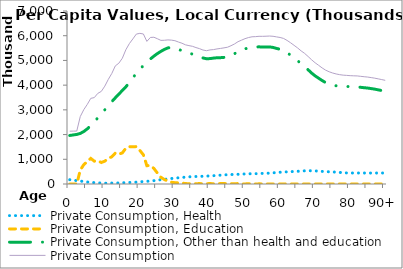
| Category | Private Consumption, Health | Private Consumption, Education | Private Consumption, Other than health and education | Private Consumption |
|---|---|---|---|---|
| 0 | 173853.621 | 0 | 1963426.39 | 2137280.01 |
|  | 155418.292 | 0 | 1984840.847 | 2140259.139 |
| 2 | 136982.963 | 0 | 2005407.284 | 2142390.247 |
| 3 | 118547.634 | 563864.51 | 2046643.158 | 2729055.303 |
| 4 | 100112.306 | 783621.737 | 2123383.9 | 3007117.942 |
| 5 | 81676.977 | 906953.405 | 2231471.992 | 3220102.374 |
| 6 | 65371.596 | 1036358.571 | 2364540.45 | 3466270.617 |
| 7 | 55404.873 | 923372.357 | 2516815.128 | 3495592.358 |
| 8 | 46769.484 | 944300.276 | 2675364.176 | 3666433.936 |
| 9 | 38355.059 | 869132.09 | 2839354.817 | 3746841.967 |
| 10 | 32100.795 | 925137.553 | 3002329.648 | 3959567.996 |
| 11 | 35147.378 | 1032438.103 | 3166960.657 | 4234546.138 |
| 12 | 37908.249 | 1103334.687 | 3332420.873 | 4473663.808 |
| 13 | 40200.229 | 1252647.324 | 3487364.802 | 4780212.354 |
| 14 | 43039.774 | 1206091.938 | 3638530.026 | 4887661.739 |
| 15 | 49285.257 | 1257732.99 | 3782323.214 | 5089341.462 |
| 16 | 55375.808 | 1445821.403 | 3930143.355 | 5431340.566 |
| 17 | 61417.954 | 1509816.078 | 4108632.358 | 5679866.39 |
| 18 | 68628.542 | 1504838.275 | 4296283.09 | 5869749.907 |
| 19 | 76582.108 | 1513842.453 | 4476067.196 | 6066491.756 |
| 20 | 88860.388 | 1359057.82 | 4647778.962 | 6095697.17 |
| 21 | 98957.613 | 1182570.649 | 4788504.256 | 6070032.518 |
| 22 | 109801.226 | 740996.506 | 4919613.663 | 5770411.396 |
| 23 | 121464.109 | 750422.563 | 5057446.402 | 5929333.074 |
| 24 | 135444.22 | 629214.865 | 5173731.841 | 5938390.926 |
| 25 | 156962.234 | 443621.995 | 5277370.327 | 5877954.556 |
| 26 | 172335.759 | 272082.706 | 5366790.945 | 5811209.41 |
| 27 | 188542.414 | 180641.899 | 5446422.106 | 5815606.42 |
| 28 | 205697.64 | 117236.314 | 5506913.151 | 5829847.105 |
| 29 | 220702.848 | 70641.62 | 5529892.168 | 5821236.636 |
| 30 | 238760.27 | 53684.319 | 5506296.268 | 5798740.858 |
| 31 | 249434.411 | 43990.024 | 5451161.86 | 5744586.294 |
| 32 | 264801.388 | 40606.285 | 5391169.393 | 5696577.066 |
| 33 | 276509.516 | 16310.946 | 5338593.932 | 5631414.394 |
| 34 | 288211.326 | 12779.046 | 5297619.048 | 5598609.42 |
| 35 | 299841.165 | 15859.69 | 5256084.654 | 5571785.509 |
| 36 | 302262.586 | 9260.126 | 5208600.739 | 5520123.452 |
| 37 | 306769.141 | 18751.642 | 5151482.417 | 5477003.201 |
| 38 | 313500.323 | 6994.103 | 5100271.357 | 5420765.784 |
| 39 | 317569.759 | 7470.835 | 5069038.114 | 5394078.709 |
| 40 | 330052.803 | 21102.578 | 5073820.366 | 5424975.747 |
| 41 | 337067.752 | 7025.801 | 5093713.88 | 5437807.432 |
| 42 | 349852.909 | 6639.319 | 5108745.411 | 5465237.639 |
| 43 | 356363.582 | 17775.208 | 5111625.373 | 5485764.164 |
| 44 | 367181.709 | 17813.554 | 5123555.68 | 5508550.943 |
| 45 | 375869.329 | 17000.667 | 5141604.132 | 5534474.128 |
| 46 | 382425.113 | 11174.751 | 5201758.831 | 5595358.695 |
| 47 | 387928.855 | 5621.76 | 5272555.78 | 5666106.395 |
| 48 | 391599.672 | 19606.231 | 5347175.444 | 5758381.347 |
| 49 | 398505.477 | 0 | 5421436.138 | 5819941.615 |
| 50 | 407974.853 | 3399.871 | 5469366.968 | 5880741.692 |
| 51 | 411508.359 | 11226.75 | 5503163.938 | 5925899.046 |
| 52 | 416753.301 | 8201.202 | 5531738.516 | 5956693.018 |
| 53 | 418802.436 | 952.704 | 5543005.949 | 5962761.09 |
| 54 | 419981.279 | 6011.406 | 5549835.56 | 5975828.245 |
| 55 | 429559.895 | 3265.507 | 5541978.781 | 5974804.184 |
| 56 | 433328.703 | 3349.568 | 5543034.347 | 5979712.618 |
| 57 | 439391.803 | 0 | 5547189.076 | 5986580.879 |
| 58 | 451194.718 | 0 | 5525286.318 | 5976481.037 |
| 59 | 465694.608 | 1212.846 | 5485242.459 | 5952149.913 |
| 60 | 475851.032 | 0 | 5452720.657 | 5928571.689 |
| 61 | 486542.087 | 4283.133 | 5398905.939 | 5889731.158 |
| 62 | 491804.559 | 2968.421 | 5314449.187 | 5809222.167 |
| 63 | 500947.609 | 0 | 5212672.8 | 5713620.409 |
| 64 | 504546.994 | 0 | 5105628.269 | 5610175.263 |
| 65 | 515039.644 | 0 | 4990242.919 | 5505282.564 |
| 66 | 517327.816 | 0 | 4868927.301 | 5386255.117 |
| 67 | 532954.017 | 0 | 4752293.16 | 5285247.177 |
| 68 | 537325.346 | 0 | 4620660.326 | 5157985.672 |
| 69 | 536157.805 | 0 | 4488394.229 | 5024552.035 |
| 70 | 529975.375 | 0 | 4374981.688 | 4904957.062 |
| 71 | 520242.779 | 0 | 4280911.1 | 4801153.88 |
| 72 | 509559.779 | 0 | 4186675.939 | 4696235.719 |
| 73 | 503159.294 | 0 | 4102783.356 | 4605942.65 |
| 74 | 493217.502 | 2718.867 | 4045214.387 | 4541150.757 |
| 75 | 488750.711 | 0 | 4002152.936 | 4490903.647 |
| 76 | 479282.515 | 0 | 3973426.153 | 4452708.668 |
| 77 | 469299.247 | 3803.624 | 3951039.443 | 4424142.314 |
| 78 | 454074.674 | 0 | 3950560.871 | 4404635.545 |
| 79 | 449227.203 | 0 | 3945603.462 | 4394830.666 |
| 80 | 444708.433 | 0 | 3939048.81 | 4383757.243 |
| 81 | 444708.433 | 0 | 3932560.301 | 4377268.734 |
| 82 | 444708.433 | 0 | 3927871.84 | 4372580.273 |
| 83 | 444708.433 | 0 | 3911866.202 | 4356574.635 |
| 84 | 444708.433 | 0 | 3895975.736 | 4340684.169 |
| 85 | 444708.433 | 0 | 3881793.644 | 4326502.077 |
| 86 | 444708.433 | 0 | 3860573.432 | 4305281.865 |
| 87 | 444708.433 | 0 | 3837627.561 | 4282335.994 |
| 88 | 444708.433 | 0 | 3809307.015 | 4254015.448 |
| 89 | 444708.433 | 0 | 3780014.88 | 4224723.313 |
| 90+ | 444708.433 | 0 | 3749915.106 | 4194623.539 |